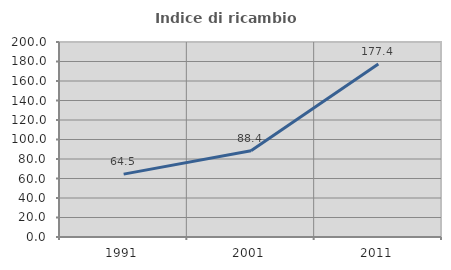
| Category | Indice di ricambio occupazionale  |
|---|---|
| 1991.0 | 64.478 |
| 2001.0 | 88.384 |
| 2011.0 | 177.365 |